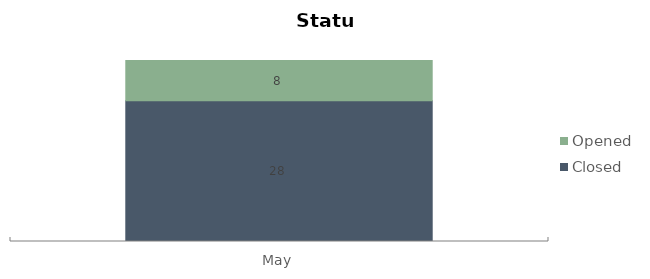
| Category | Closed | Opened |
|---|---|---|
| May | 28 | 8 |